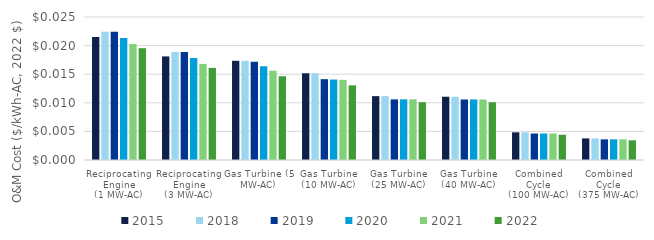
| Category | 2015 | 2018 | 2019 | 2020 | 2021 | 2022 |
|---|---|---|---|---|---|---|
| Reciprocating Engine
(1 MW-AC) | 0.022 | 0.022 | 0.022 | 0.021 | 0.02 | 0.02 |
| Reciprocating Engine
(3 MW-AC) | 0.018 | 0.019 | 0.019 | 0.018 | 0.017 | 0.016 |
| Gas Turbine (5 MW-AC) | 0.017 | 0.017 | 0.017 | 0.016 | 0.016 | 0.015 |
| Gas Turbine (10 MW-AC) | 0.015 | 0.015 | 0.014 | 0.014 | 0.014 | 0.013 |
| Gas Turbine (25 MW-AC) | 0.011 | 0.011 | 0.011 | 0.011 | 0.011 | 0.01 |
| Gas Turbine (40 MW-AC) | 0.011 | 0.011 | 0.011 | 0.011 | 0.011 | 0.01 |
| Combined Cycle
(100 MW-AC) | 0.005 | 0.005 | 0.005 | 0.005 | 0.005 | 0.004 |
| Combined Cycle
(375 MW-AC) | 0.004 | 0.004 | 0.004 | 0.004 | 0.004 | 0.003 |